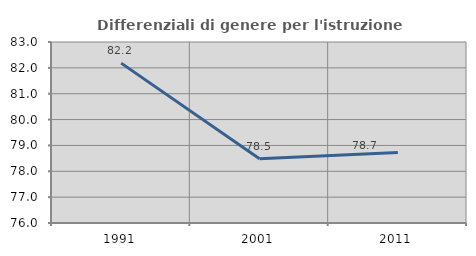
| Category | Differenziali di genere per l'istruzione superiore |
|---|---|
| 1991.0 | 82.183 |
| 2001.0 | 78.487 |
| 2011.0 | 78.731 |